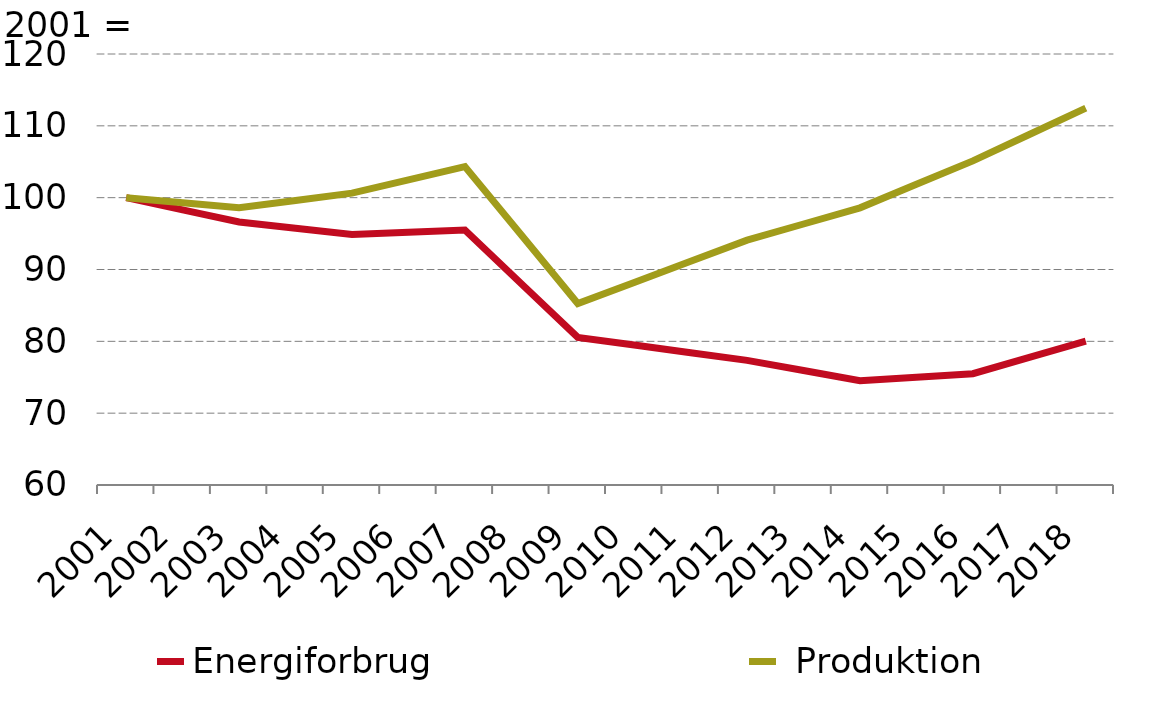
| Category | Energiforbrug |  Produktion |
|---|---|---|
| 2001.0 | 100 | 100 |
| 2002.0 | 98.31 | 99.297 |
| 2003.0 | 96.62 | 98.595 |
| 2004.0 | 95.742 | 99.613 |
| 2005.0 | 94.864 | 100.632 |
| 2006.0 | 95.182 | 102.478 |
| 2007.0 | 95.499 | 104.324 |
| 2008.0 | 88.027 | 94.79 |
| 2009.0 | 80.554 | 85.256 |
| 2010.0 | 79.485 | 88.197 |
| 2011.0 | 78.416 | 91.138 |
| 2012.0 | 77.347 | 94.079 |
| 2013.0 | 75.935 | 96.333 |
| 2014.0 | 74.524 | 98.586 |
| 2015.0 | 75.011 | 101.854 |
| 2016.0 | 75.499 | 105.123 |
| 2017.0 | 77.759 | 108.79 |
| 2018.0 | 80.019 | 112.457 |